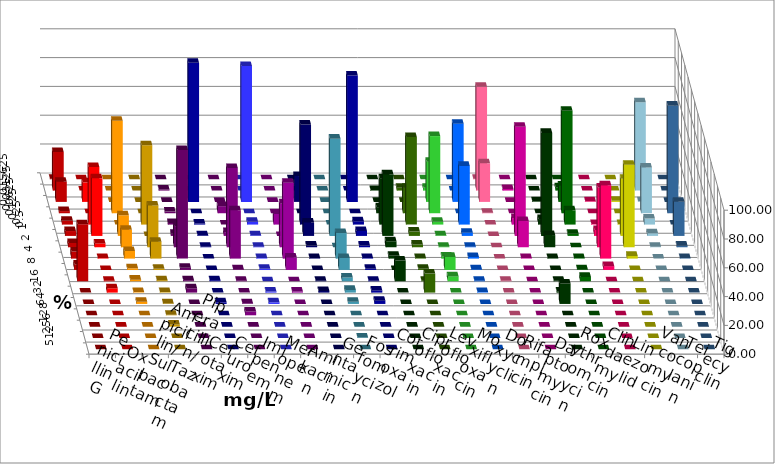
| Category | Penicillin G | Oxacillin | Ampicillin/ Sulbactam | Piperacillin/ Tazobactam | Cefotaxim | Cefuroxim | Imipenem | Meropenem | Amikacin | Gentamicin | Fosfomycin | Cotrimoxazol | Ciprofloxacin | Levofloxacin | Moxifloxacin | Doxycyclin | Rifampicin | Daptomycin | Roxythromycin | Clindamycin | Linezolid | Vancomycin | Teicoplanin | Tigecyclin |
|---|---|---|---|---|---|---|---|---|---|---|---|---|---|---|---|---|---|---|---|---|---|---|---|---|
| 0.015625 | 0.377 | 0 | 0 | 0 | 0 | 0 | 0 | 0 | 0 | 0 | 0 | 0 | 0 | 0 | 0 | 0 | 0.377 | 0 | 0 | 0 | 0 | 0 | 0 | 0 |
| 0.03125 | 26.792 | 0 | 0 | 0 | 0.755 | 0 | 0 | 0 | 0 | 0 | 0 | 0 | 0.379 | 1.887 | 1.887 | 0 | 72.075 | 1.136 | 0 | 2.281 | 0 | 0 | 0 | 61.364 |
| 0.0625 | 13.962 | 13.585 | 0 | 0 | 0 | 0 | 96.604 | 94.34 | 0 | 17.969 | 0 | 87.833 | 0 | 0 | 27.925 | 54.34 | 26.792 | 0 | 0.385 | 11.407 | 0.377 | 0.755 | 0 | 0.379 |
| 0.125 | 1.509 | 0 | 64.151 | 0 | 1.132 | 4.906 | 0 | 0 | 0 | 0 | 0 | 0 | 4.167 | 17.736 | 53.585 | 0 | 0.377 | 0 | 0 | 71.103 | 0 | 0 | 74.717 | 31.818 |
| 0.25 | 2.642 | 40 | 0 | 55.094 | 1.132 | 0 | 0.755 | 1.887 | 7.422 | 69.531 | 0 | 2.281 | 32.197 | 60.755 | 1.887 | 40.755 | 0 | 4.545 | 3.846 | 9.886 | 0.377 | 0.377 | 0 | 4.167 |
| 0.5 | 3.396 | 40 | 14.34 | 0 | 1.509 | 2.642 | 0.377 | 0.377 | 0 | 9.375 | 67.547 | 3.422 | 42.803 | 3.019 | 0.377 | 2.264 | 0 | 75.758 | 71.538 | 1.521 | 4.151 | 39.623 | 23.774 | 1.894 |
| 1.0 | 3.019 | 2.642 | 12.075 | 29.057 | 14.717 | 55.094 | 0.377 | 0.377 | 30.469 | 1.172 | 0 | 1.141 | 4.167 | 1.887 | 0.377 | 0.377 | 0 | 18.182 | 8.462 | 0 | 41.509 | 57.358 | 1.132 | 0.379 |
| 2.0 | 4.906 | 0.377 | 5.283 | 11.698 | 75.472 | 33.585 | 0 | 0.377 | 52.734 | 0.391 | 17.736 | 0.38 | 1.894 | 0.377 | 1.509 | 1.132 | 0 | 0.379 | 0.385 | 0.38 | 50.943 | 1.887 | 0.377 | 0 |
| 4.0 | 3.774 | 0 | 1.132 | 0.755 | 1.509 | 0.377 | 0 | 0.755 | 8.594 | 0 | 8.302 | 0.76 | 0 | 0.755 | 9.057 | 0.377 | 0 | 0 | 0 | 0.38 | 2.642 | 0 | 0 | 0 |
| 8.0 | 39.623 | 0.377 | 1.132 | 0.755 | 0.755 | 0.377 | 0.755 | 0 | 0 | 0.391 | 2.642 | 0.38 | 14.394 | 0.377 | 3.396 | 0.377 | 0.377 | 0 | 0.385 | 3.042 | 0 | 0 | 0 | 0 |
| 16.0 | 0 | 3.019 | 0.377 | 0.377 | 3.019 | 0 | 0 | 0.755 | 0.781 | 1.172 | 1.887 | 1.521 | 0 | 13.208 | 0 | 0.377 | 0 | 0 | 0.769 | 0 | 0 | 0 | 0 | 0 |
| 32.0 | 0 | 0 | 1.509 | 0.377 | 0 | 0.377 | 1.132 | 1.132 | 0 | 0 | 1.509 | 2.281 | 0 | 0 | 0 | 0 | 0 | 0 | 14.231 | 0 | 0 | 0 | 0 | 0 |
| 64.0 | 0 | 0 | 0 | 0.377 | 0 | 2.642 | 0 | 0 | 0 | 0 | 0 | 0 | 0 | 0 | 0 | 0 | 0 | 0 | 0 | 0 | 0 | 0 | 0 | 0 |
| 128.0 | 0 | 0 | 0 | 1.509 | 0 | 0 | 0 | 0 | 0 | 0 | 0 | 0 | 0 | 0 | 0 | 0 | 0 | 0 | 0 | 0 | 0 | 0 | 0 | 0 |
| 256.0 | 0 | 0 | 0 | 0 | 0 | 0 | 0 | 0 | 0 | 0 | 0.377 | 0 | 0 | 0 | 0 | 0 | 0 | 0 | 0 | 0 | 0 | 0 | 0 | 0 |
| 512.0 | 0 | 0 | 0 | 0 | 0 | 0 | 0 | 0 | 0 | 0 | 0 | 0 | 0 | 0 | 0 | 0 | 0 | 0 | 0 | 0 | 0 | 0 | 0 | 0 |